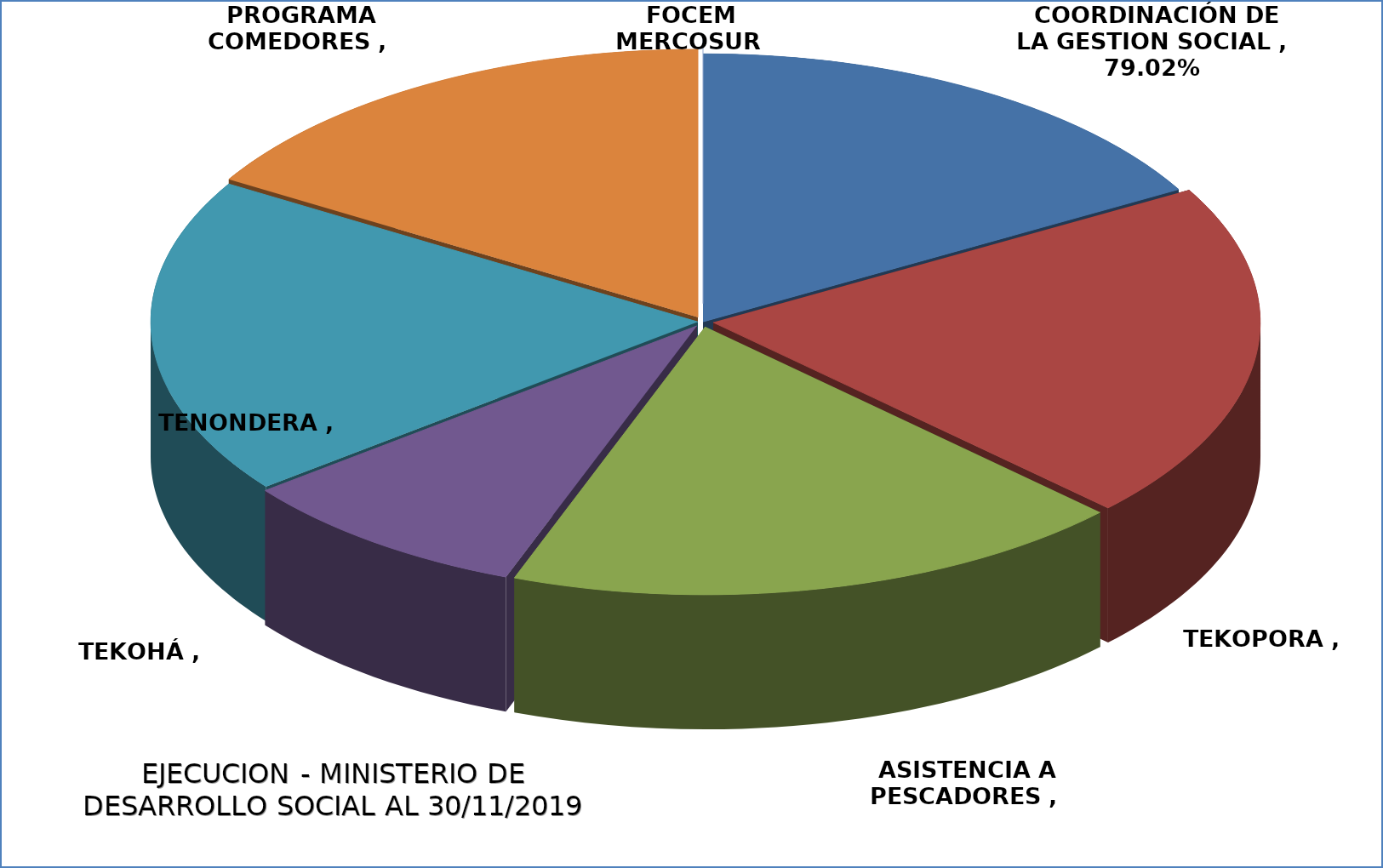
| Category | EJECUCIÓN - MINISTERIO DE DESARROLLO SOCIAL |
|---|---|
| COORDINACIÓN DE LA GESTION SOCIAL | 0.79 |
| TEKOPORA | 0.961 |
| ASISTENCIA A PESCADORES | 0.872 |
| TEKOHÁ | 0.414 |
| TENONDERA | 0.902 |
| PROGRAMA COMEDORES | 0.772 |
| FOCEM MERCOSUR YPORA | 0 |